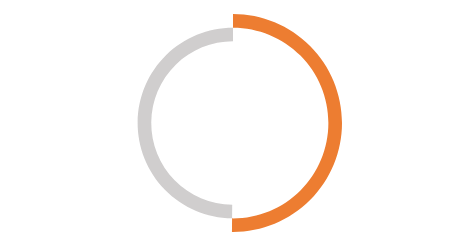
| Category | 2022 |
|---|---|
| Suma de Total pes familia assolit per municipi | 16236.3 |
| Pendent de consecució | -16136.3 |